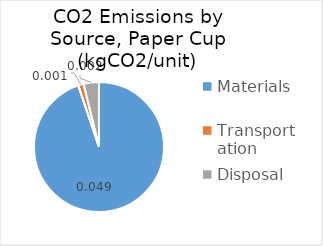
| Category | Series 0 |
|---|---|
| Materials | 0.049 |
| Transportation | 0.001 |
| Disposal | 0.002 |